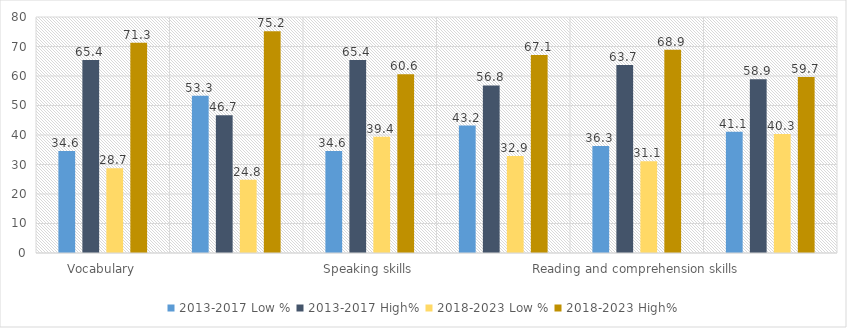
| Category | 2013-2017 | 2018-2023 |
|---|---|---|
| Vocabulary | 65.4 | 71.3 |
| Writing skills | 46.7 | 75.2 |
| Speaking skills | 65.4 | 60.6 |
| Listening and comprehension ability | 56.8 | 67.1 |
| Reading and comprehension skills | 63.7 | 68.9 |
| Overall effectiveness of the communication skill programme | 58.9 | 59.7 |